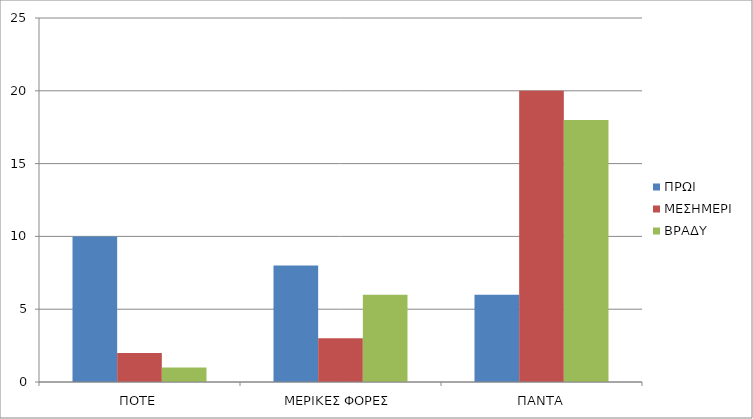
| Category | ΠΡΩΙ | ΜΕΣΗΜΕΡΙ | ΒΡΑΔΥ |
|---|---|---|---|
| ΠΟΤΕ | 10 | 2 | 1 |
| ΜΕΡΙΚΕΣ ΦΟΡΕΣ | 8 | 3 | 6 |
| ΠΑΝΤΑ | 6 | 20 | 18 |